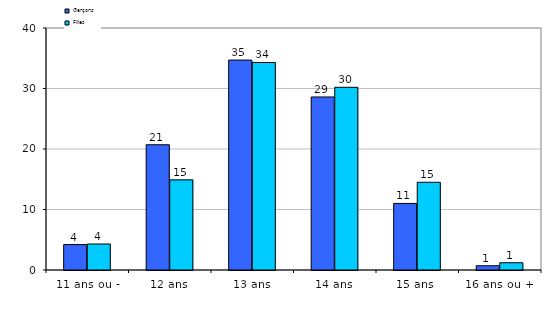
| Category | Garçons | Filles |
|---|---|---|
| 11 ans ou - | 4.2 | 4.3 |
| 12 ans | 20.7 | 14.9 |
| 13 ans | 34.7 | 34.3 |
| 14 ans | 28.6 | 30.2 |
| 15 ans  | 11 | 14.5 |
| 16 ans ou + | 0.7 | 1.2 |